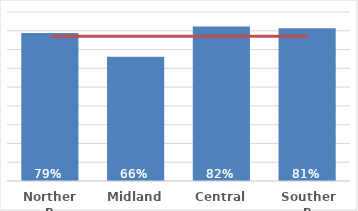
| Category | Total |
|---|---|
| Northern | 0.788 |
| Midland | 0.662 |
| Central | 0.822 |
| Southern | 0.814 |